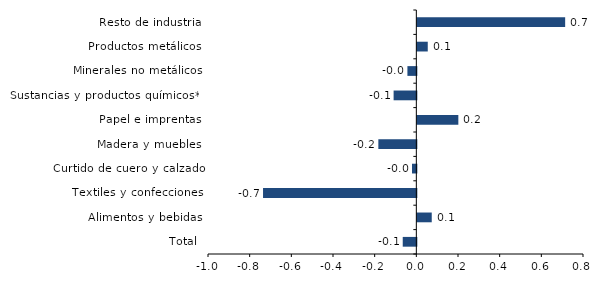
| Category | Series 0 |
|---|---|
| Total | -0.065 |
| Alimentos y bebidas | 0.069 |
| Textiles y confecciones | -0.736 |
| Curtido de cuero y calzado | -0.021 |
| Madera y muebles | -0.182 |
| Papel e imprentas | 0.197 |
| Sustancias y productos químicos** | -0.109 |
| Minerales no metálicos | -0.043 |
| Productos metálicos | 0.05 |
| Resto de industria | 0.71 |